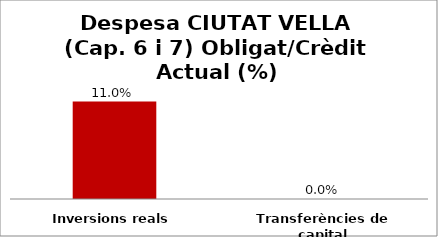
| Category | Series 0 |
|---|---|
| Inversions reals | 0.11 |
| Transferències de capital | 0 |